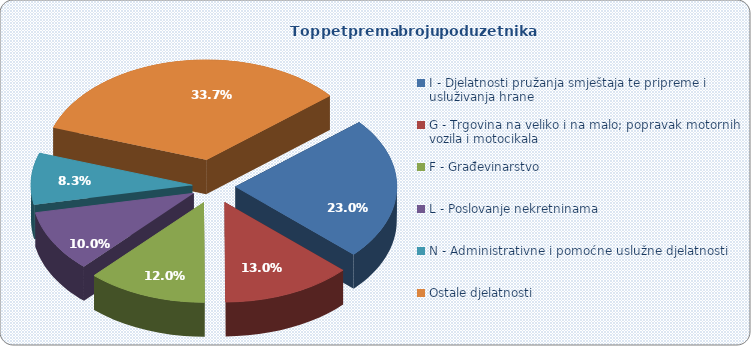
| Category | Broj poduzetnika 2020. |
|---|---|
| I - Djelatnosti pružanja smještaja te pripreme i usluživanja hrane  | 1171 |
| G - Trgovina na veliko i na malo; popravak motornih vozila i motocikala | 662 |
| F - Građevinarstvo | 610 |
| L - Poslovanje nekretninama | 507 |
| N - Administrativne i pomoćne uslužne djelatnosti | 423 |
| Ostale djelatnosti | 1714 |